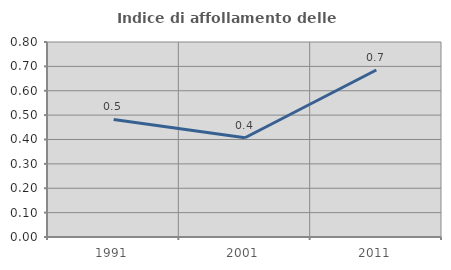
| Category | Indice di affollamento delle abitazioni  |
|---|---|
| 1991.0 | 0.482 |
| 2001.0 | 0.407 |
| 2011.0 | 0.685 |